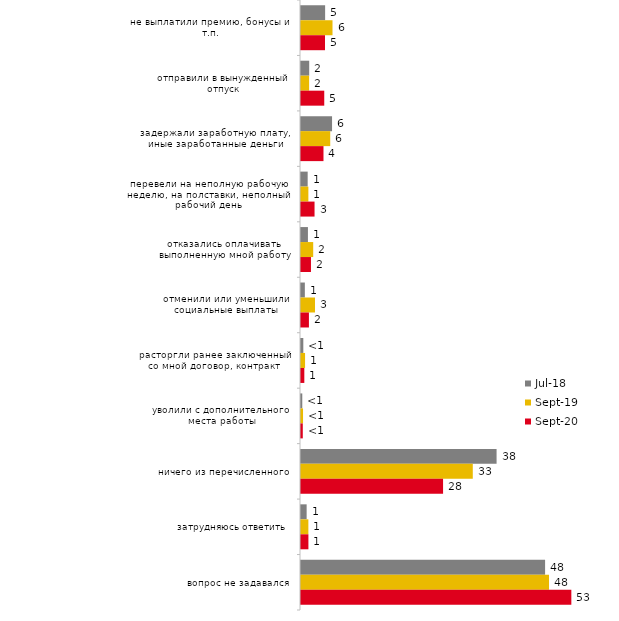
| Category | июл.18 | сен.19 | сен.20 |
|---|---|---|---|
| не выплатили премию, бонусы и т.п. | 4.7 | 6.139 | 4.679 |
| отправили в вынужденный отпуск | 1.6 | 1.584 | 4.53 |
| задержали заработную плату, иные заработанные деньги | 6.05 | 5.693 | 4.38 |
| перевели на неполную рабочую неделю, на полставки, неполный рабочий день | 1.3 | 1.436 | 2.638 |
| отказались оплачивать выполненную мной работу | 1.35 | 2.376 | 1.941 |
| отменили или уменьшили социальные выплаты | 0.75 | 2.723 | 1.543 |
| расторгли ранее заключенный со мной договор, контракт | 0.45 | 0.792 | 0.647 |
| уволили с дополнительного места работы | 0.25 | 0.396 | 0.348 |
| ничего из перечисленного | 38.1 | 33.465 | 27.675 |
| затрудняюсь ответить | 1.1 | 1.436 | 1.444 |
| вопрос не задавался | 47.55 | 48.317 | 52.663 |